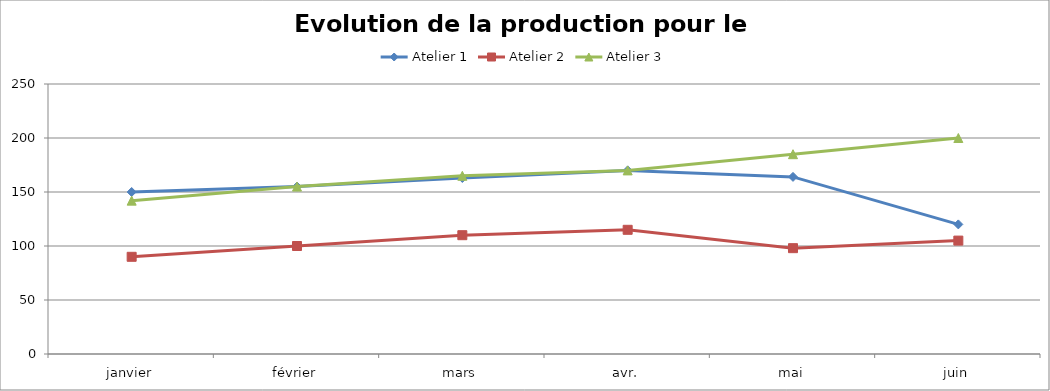
| Category | Atelier 1 | Atelier 2 | Atelier 3 |
|---|---|---|---|
| janvier | 150 | 90 | 142 |
| février | 155 | 100 | 155 |
| mars | 163 | 110 | 165 |
| avr. | 170 | 115 | 170 |
| mai | 164 | 98 | 185 |
| juin | 120 | 105 | 200 |